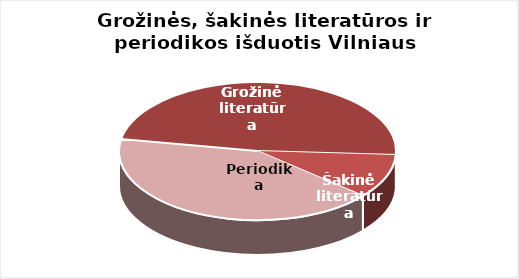
| Category | Series 0 |
|---|---|
| Grožinė literatūra | 721774 |
| Šakinė literatūra | 155511 |
| Periodika | 623274 |